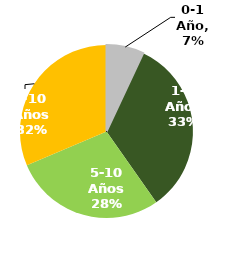
| Category | Series 0 |
|---|---|
| 0-1 Año | 0.07 |
| 1-5 Años | 0.333 |
| 5-10 Años | 0.284 |
| +10 Años | 0.314 |